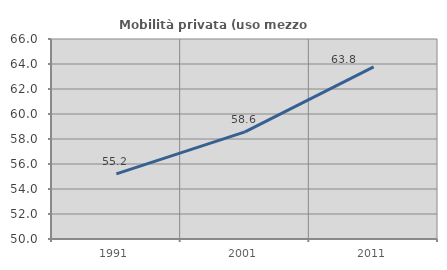
| Category | Mobilità privata (uso mezzo privato) |
|---|---|
| 1991.0 | 55.215 |
| 2001.0 | 58.575 |
| 2011.0 | 63.767 |